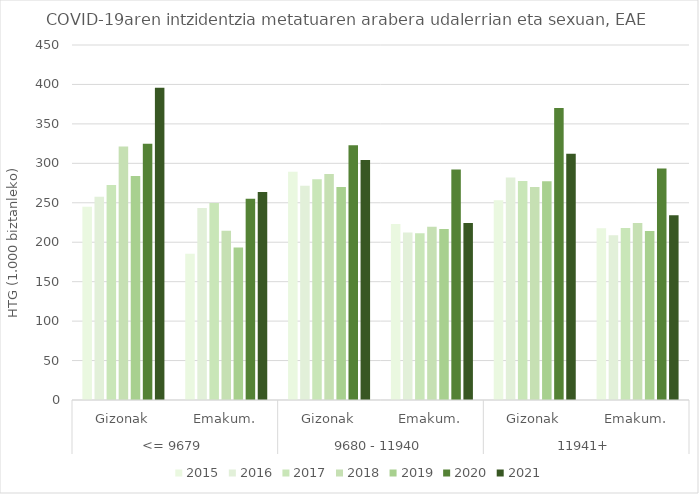
| Category | 2015 | 2016 | 2017 | 2018 | 2019 | 2020 | 2021 |
|---|---|---|---|---|---|---|---|
| 0 | 245.115 | 257.627 | 272.446 | 321.429 | 283.951 | 324.841 | 395.867 |
| 1 | 185.304 | 243.305 | 249.817 | 214.592 | 193.366 | 255.227 | 263.554 |
| 2 | 289.256 | 271.572 | 279.806 | 286.418 | 269.913 | 322.917 | 304.333 |
| 3 | 223.145 | 212.477 | 211.495 | 219.59 | 216.689 | 292.13 | 224.215 |
| 4 | 253.107 | 282.142 | 277.603 | 270.053 | 277.386 | 370.216 | 312.272 |
| 5 | 217.639 | 208.68 | 218.15 | 224.411 | 214.067 | 293.415 | 234.278 |